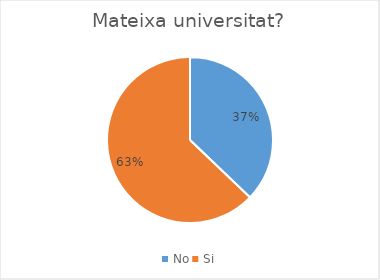
| Category | Series 0 |
|---|---|
| No | 13 |
| Si | 22 |